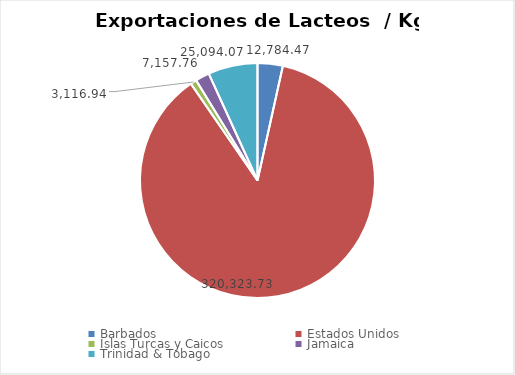
| Category | kg |
|---|---|
| Barbados | 12784.47 |
| Estados Unidos | 320323.73 |
| Islas Turcas y Caicos | 3116.94 |
| Jamaica | 7157.76 |
| Trinidad & Tobago | 25094.07 |